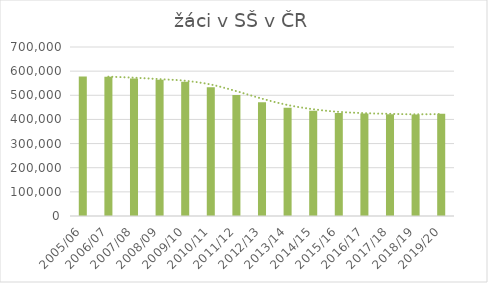
| Category | žáci v SŠ v ČR |
|---|---|
| 2005/06 | 577605 |
| 2006/07 | 576585 |
| 2007/08 | 569267 |
| 2008/09 | 564326 |
| 2009/10 | 556260 |
| 2010/11 | 532918 |
| 2011/12 | 501220 |
| 2012/13 | 470754 |
| 2013/14 | 448792 |
| 2014/15 | 435542 |
| 2015/16 | 427107 |
| 2016/17 | 424849 |
| 2017/18 | 421535 |
| 2018/19 | 420814 |
| 2019/20 | 423838 |